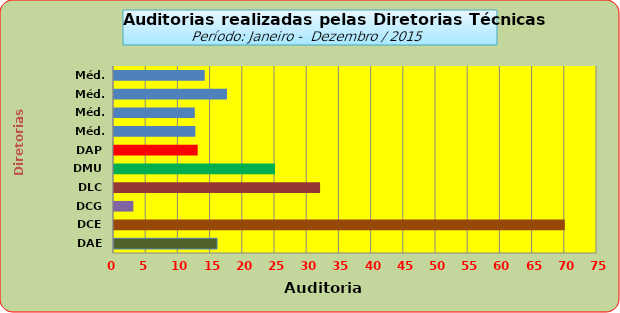
| Category | Series 0 |
|---|---|
| DAE | 16 |
| DCE | 70 |
| DCG | 3 |
| DLC | 32 |
| DMU | 25 |
| DAP | 13 |
| Méd. 2011 | 12.636 |
| Méd. 2012 | 12.545 |
| Méd. 2013 | 17.545 |
| Méd. 2014 | 14.091 |